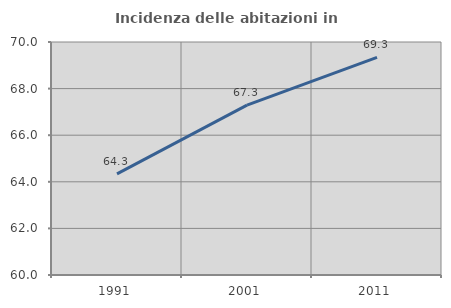
| Category | Incidenza delle abitazioni in proprietà  |
|---|---|
| 1991.0 | 64.341 |
| 2001.0 | 67.288 |
| 2011.0 | 69.343 |